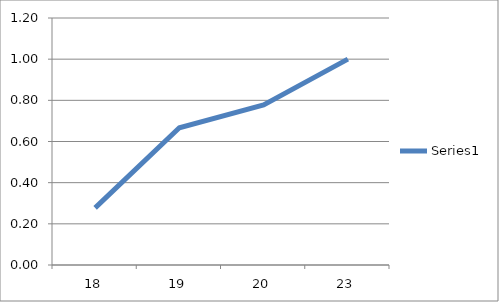
| Category | Series 0 |
|---|---|
| 18.0 | 0.278 |
| 19.0 | 0.667 |
| 20.0 | 0.778 |
| 23.0 | 1 |